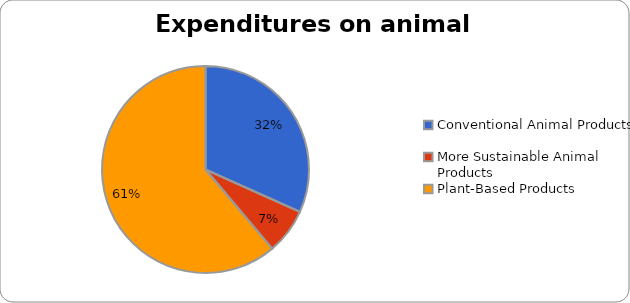
| Category | Series 0 |
|---|---|
| Conventional Animal Products | 0.317 |
| More Sustainable Animal Products | 0.071 |
| Plant-Based Products | 0.611 |